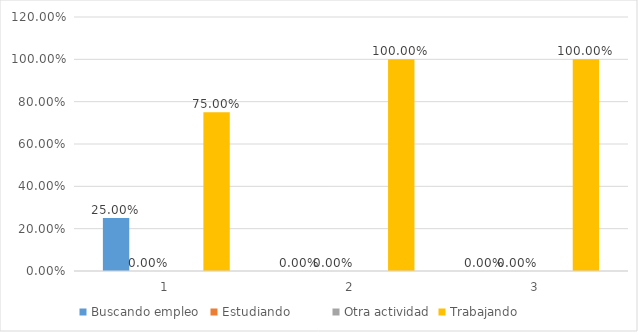
| Category | Buscando empleo  | Estudiando          | Otra actividad | Trabajando          |
|---|---|---|---|---|
| 0 | 0.25 | 0 | 0 | 0.75 |
| 1 | 0 | 0 | 0 | 1 |
| 2 | 0 | 0 | 0 | 1 |